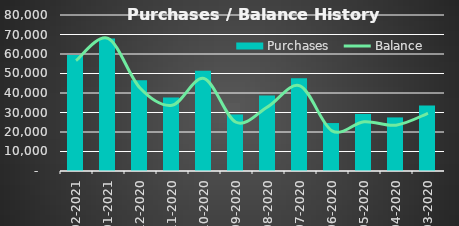
| Category |  Purchases  |
|---|---|
| 2021-02-28 | 59489.76 |
| 2021-01-31 | 67969.92 |
| 2020-12-31 | 46547.04 |
| 2020-11-30 | 37716.6 |
| 2020-10-31 | 51385.2 |
| 2020-09-30 | 28984.2 |
| 2020-08-31 | 38697 |
| 2020-07-31 | 47623.2 |
| 2020-06-30 | 24586.08 |
| 2020-05-31 | 29260.4 |
| 2020-04-30 | 27479.4 |
| 2020-03-31 | 33555.6 |